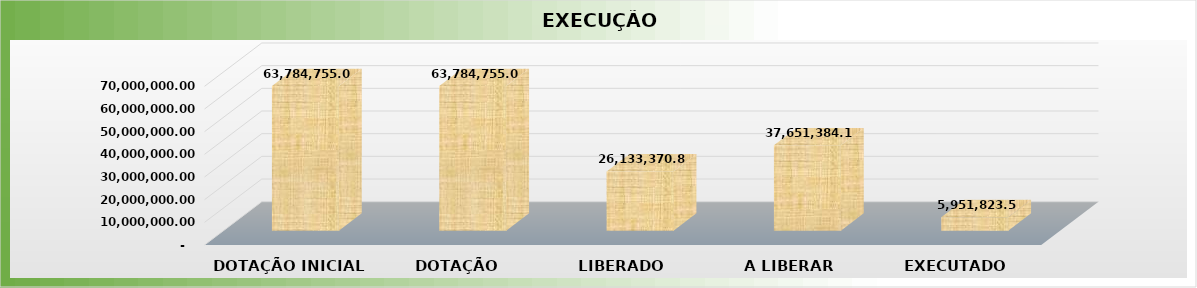
| Category | Series 0 |
|---|---|
| 0 | 63784755 |
| 1 | 63784755 |
| 2 | 26133370.86 |
| 3 | 37651384.14 |
| 4 | 5951823.54 |